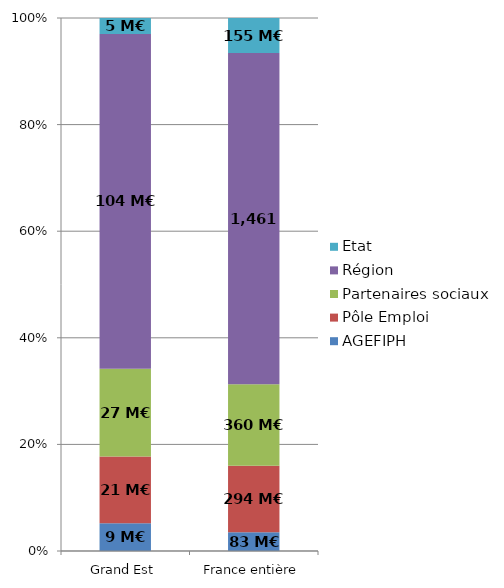
| Category | AGEFIPH | Pôle Emploi | Partenaires sociaux | Région | Etat |
|---|---|---|---|---|---|
| Grand Est | 8.611 | 20.769 | 27.339 | 104.235 | 4.947 |
| France entière | 82.716 | 293.959 | 359.593 | 1461.057 | 154.74 |